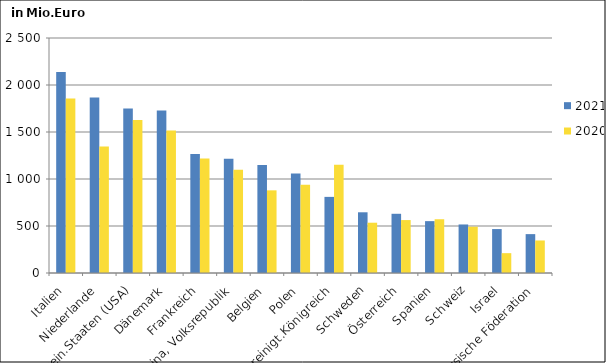
| Category | 2021 | 2020 |
|---|---|---|
| Italien | 2138.665 | 1855.608 |
| Niederlande | 1867.489 | 1344.752 |
| Verein.Staaten (USA) | 1749.258 | 1627.313 |
| Dänemark | 1728.878 | 1515.669 |
| Frankreich | 1264.682 | 1217.975 |
| China, Volksrepublik | 1214.488 | 1097.588 |
| Belgien | 1149.169 | 879.385 |
| Polen | 1057.455 | 938.379 |
| Vereinigt.Königreich | 809.784 | 1151.626 |
| Schweden | 645.913 | 534.935 |
| Österreich | 629.929 | 563.166 |
| Spanien | 551.739 | 571.839 |
| Schweiz | 516.341 | 492.122 |
| Israel | 467.419 | 211.015 |
| Russische Föderation | 413.641 | 346.02 |